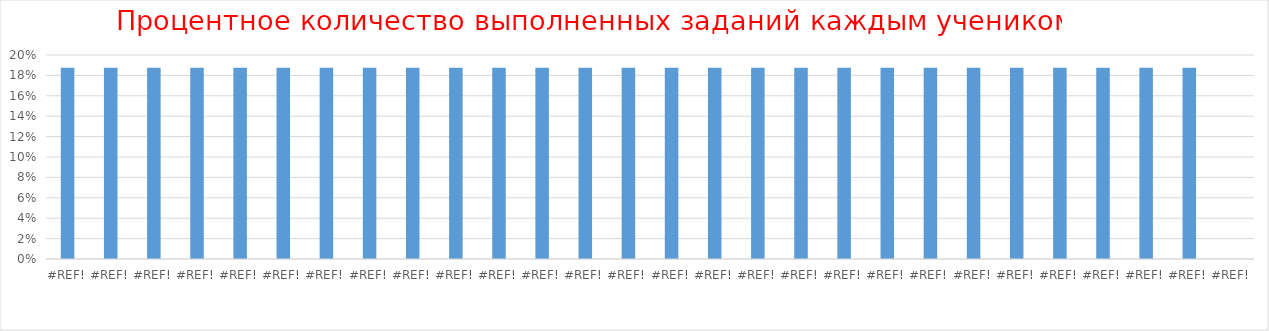
| Category | Series 0 |
|---|---|
| 0.0 | 0.188 |
| 0.0 | 0.188 |
| 0.0 | 0.188 |
| 0.0 | 0.188 |
| 0.0 | 0.188 |
| 0.0 | 0.188 |
| 0.0 | 0.188 |
| 0.0 | 0.188 |
| 0.0 | 0.188 |
| 0.0 | 0.188 |
| 0.0 | 0.188 |
| 0.0 | 0.188 |
| 0.0 | 0.188 |
| 0.0 | 0.188 |
| 0.0 | 0.188 |
| 0.0 | 0.188 |
| 0.0 | 0.188 |
| 0.0 | 0.188 |
| 0.0 | 0.188 |
| 0.0 | 0.188 |
| 0.0 | 0.188 |
| 0.0 | 0.188 |
| 0.0 | 0.188 |
| 0.0 | 0.188 |
| 0.0 | 0.188 |
| 0.0 | 0.188 |
| 0.0 | 0.188 |
| 0.0 | 0 |